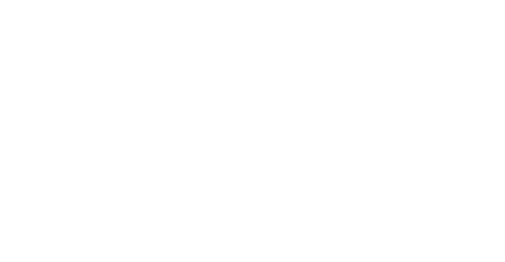
| Category | Adverse Events |
|---|---|
| Pfizer-BioNTech | 0 |
| Moderna | 0 |
| Janssen/Johnson & Johnson | 0 |